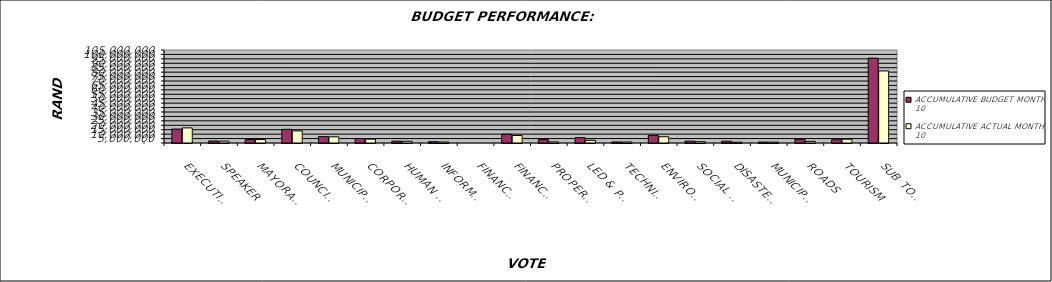
| Category | ACCUMULATIVE BUDGET MONTH  10 | ACCUMULATIVE ACTUAL MONTH  10 |
|---|---|---|
| EXECUTIVE MAYOR | 15740460 | 17045653 |
| SPEAKER | 2236863.333 | 2058673 |
| MAYORAL COMMITTEE | 4022005 | 3909508 |
| COUNCIL GENERAL | 15407232.5 | 13681851 |
| MUNICIPAL MANAGER | 7187417.5 | 6933462 |
| CORPORATE SERVICES | 5068183.333 | 4318085 |
| HUMAN RESOURCES | 2059264.167 | 1937840 |
| INFORMATION TECHNOLOGY | 1472817.5 | 1091820 |
| FINANCE TECHNICAL SUPPORT | 0 | 0 |
| FINANCE SERVICES | 9944889.167 | 8509282 |
| PROPERTY | 3826328.333 | 1243720 |
| LED & PLANNING | 6043550 | 3022587 |
| TECHNICAL SERVICES | 1200184.167 | 1140413 |
| ENVIRONMENTAL HEALTH | 8618220 | 7029318 |
| SOCIAL SERVICES | 2056243.333 | 1438573 |
| DISASTER MANAGEMENT | 1964923.333 | 934125 |
| MUNICIPAL SUPPORT | 1063283.333 | 962801 |
| ROADS | 4181822.5 | 1831019 |
| TOURISM | 3666666.667 | 4268313 |
| SUB TOTAL | 95760354.167 | 81357043 |